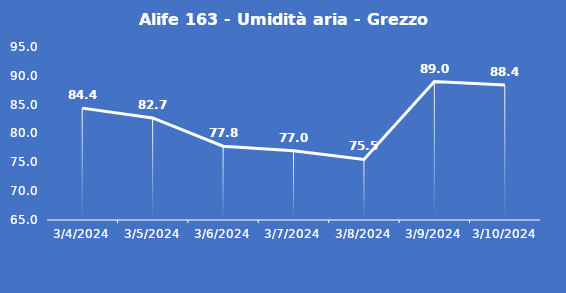
| Category | Alife 163 - Umidità aria - Grezzo (%) |
|---|---|
| 3/4/24 | 84.4 |
| 3/5/24 | 82.7 |
| 3/6/24 | 77.8 |
| 3/7/24 | 77 |
| 3/8/24 | 75.5 |
| 3/9/24 | 89 |
| 3/10/24 | 88.4 |